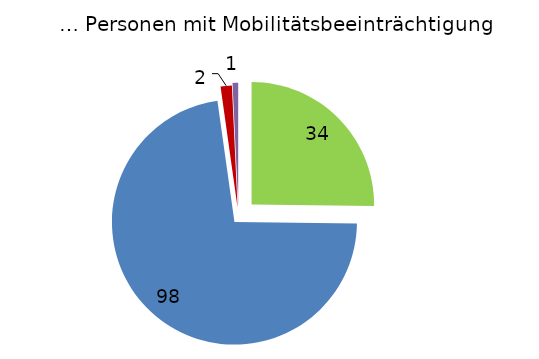
| Category | … Personen mit Mobilitätsbeeinträchtigung |
|---|---|
| Auf dem ganzen Campus | 34 |
| Auf Teilen des Campus | 98 |
| Nicht barrierefrei | 2 |
| Keine Angabe | 1 |